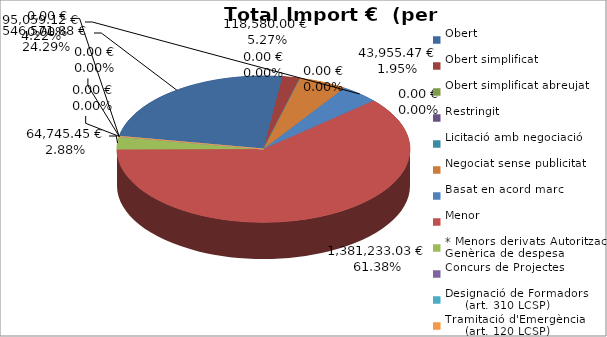
| Category | Total preu
(amb IVA) |
|---|---|
| Obert | 546571.88 |
| Obert simplificat | 43955.47 |
| Obert simplificat abreujat | 0 |
| Restringit | 0 |
| Licitació amb negociació | 0 |
| Negociat sense publicitat | 118580 |
| Basat en acord marc | 95059.12 |
| Menor | 1381233.03 |
| * Menors derivats Autorització Genèrica de despesa | 64745.45 |
| Concurs de Projectes | 0 |
| Designació de Formadors
     (art. 310 LCSP) | 0 |
| Tramitació d'Emergència
     (art. 120 LCSP) | 0 |